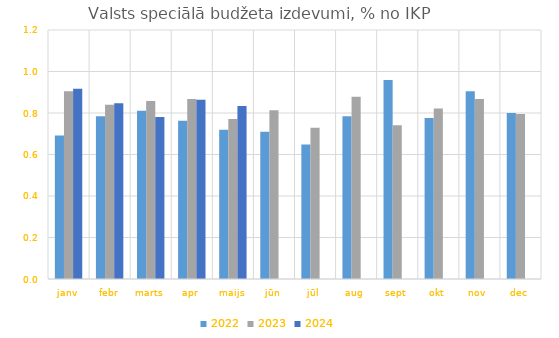
| Category | 2022 | 2023 | 2024 |
|---|---|---|---|
| janv | 0.691 | 0.904 | 0.917 |
| febr | 0.784 | 0.84 | 0.847 |
| marts | 0.811 | 0.858 | 0.781 |
| apr | 0.763 | 0.867 | 0.864 |
| maijs | 0.719 | 0.771 | 0.834 |
| jūn | 0.71 | 0.813 | 0 |
| jūl | 0.648 | 0.729 | 0 |
| aug | 0.784 | 0.879 | 0 |
| sept | 0.959 | 0.741 | 0 |
| okt | 0.776 | 0.822 | 0 |
| nov | 0.905 | 0.867 | 0 |
| dec | 0.8 | 0.795 | 0 |